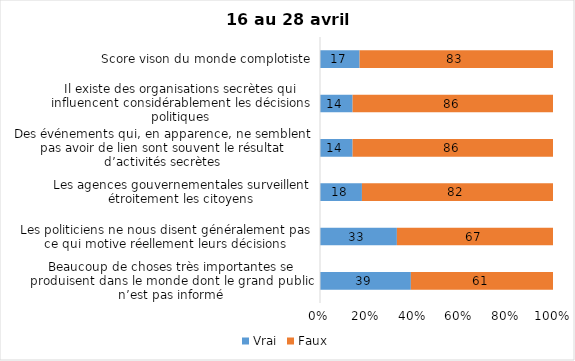
| Category | Vrai | Faux |
|---|---|---|
| Beaucoup de choses très importantes se produisent dans le monde dont le grand public n’est pas informé | 39 | 61 |
| Les politiciens ne nous disent généralement pas ce qui motive réellement leurs décisions | 33 | 67 |
| Les agences gouvernementales surveillent étroitement les citoyens | 18 | 82 |
| Des événements qui, en apparence, ne semblent pas avoir de lien sont souvent le résultat d’activités secrètes | 14 | 86 |
| Il existe des organisations secrètes qui influencent considérablement les décisions politiques | 14 | 86 |
| Score vison du monde complotiste | 17 | 83 |